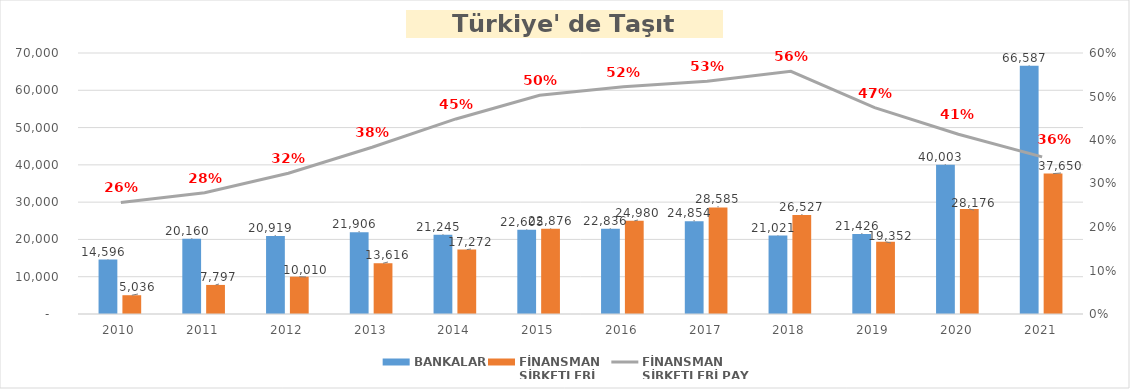
| Category | BANKALAR | FİNANSMAN 
ŞİRKETLERİ |
|---|---|---|
| 2010 | 14595.746 | 5035.89 |
| 2011 | 20160.143 | 7796.854 |
| 2012 | 20919.143 | 10009.755 |
| 2013 | 21905.99 | 13616.036 |
| 2014 | 21244.953 | 17271.844 |
| 2015 | 22605.033 | 22875.563 |
| 2016 | 22835.961 | 24980.231 |
| 2017 | 24853.571 | 28584.938 |
| 2018 | 21021.01 | 26527.133 |
| 2019 | 21426.278 | 19352.327 |
| 2020 | 40002.964 | 28176.3 |
| 2021 | 66586.576 | 37649.688 |